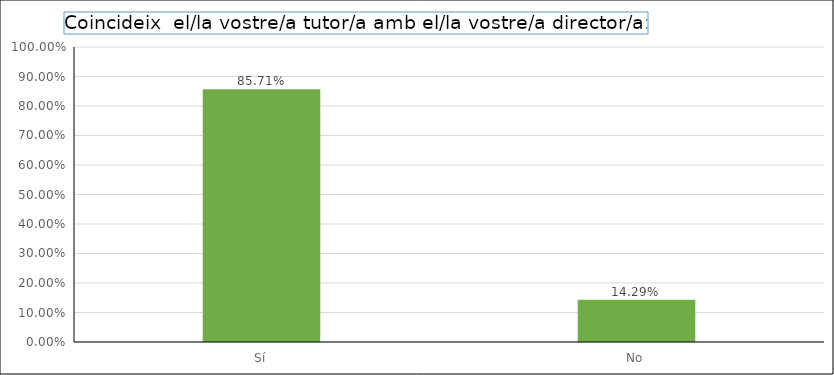
| Category | Series 0 |
|---|---|
| Sí | 0.857 |
| No | 0.143 |